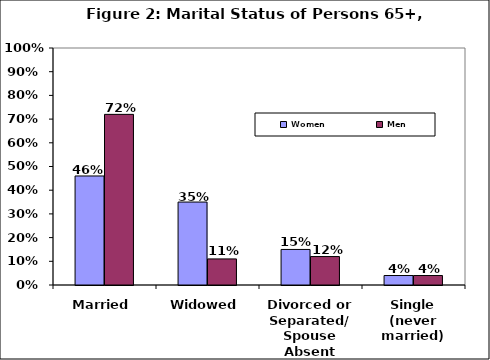
| Category | Women | Men |
|---|---|---|
| Married | 0.46 | 0.72 |
| Widowed | 0.35 | 0.11 |
| Divorced or Separated/ Spouse Absent | 0.15 | 0.12 |
| Single (never married) | 0.04 | 0.04 |